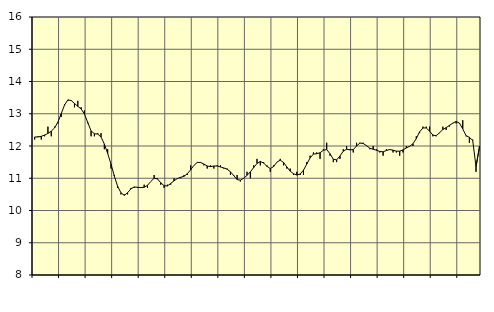
| Category | Piggar | Handel, SNI 45-47 |
|---|---|---|
| nan | 12.2 | 12.28 |
| 87.0 | 12.3 | 12.28 |
| 87.0 | 12.2 | 12.3 |
| 87.0 | 12.3 | 12.34 |
| nan | 12.6 | 12.39 |
| 88.0 | 12.3 | 12.46 |
| 88.0 | 12.6 | 12.56 |
| 88.0 | 12.7 | 12.74 |
| nan | 12.9 | 13 |
| 89.0 | 13.3 | 13.27 |
| 89.0 | 13.4 | 13.43 |
| 89.0 | 13.4 | 13.41 |
| nan | 13.2 | 13.32 |
| 90.0 | 13.4 | 13.23 |
| 90.0 | 13.2 | 13.15 |
| 90.0 | 13.1 | 12.99 |
| nan | 12.7 | 12.73 |
| 91.0 | 12.3 | 12.47 |
| 91.0 | 12.3 | 12.38 |
| 91.0 | 12.4 | 12.37 |
| nan | 12.4 | 12.28 |
| 92.0 | 11.9 | 12.06 |
| 92.0 | 11.9 | 11.77 |
| 92.0 | 11.3 | 11.44 |
| nan | 11.1 | 11.07 |
| 93.0 | 10.7 | 10.75 |
| 93.0 | 10.5 | 10.55 |
| 93.0 | 10.5 | 10.47 |
| nan | 10.5 | 10.55 |
| 94.0 | 10.7 | 10.67 |
| 94.0 | 10.7 | 10.73 |
| 94.0 | 10.7 | 10.72 |
| nan | 10.7 | 10.71 |
| 95.0 | 10.8 | 10.72 |
| 95.0 | 10.7 | 10.78 |
| 95.0 | 10.9 | 10.9 |
| nan | 11.1 | 11 |
| 96.0 | 11 | 10.98 |
| 96.0 | 10.8 | 10.86 |
| 96.0 | 10.7 | 10.77 |
| nan | 10.8 | 10.76 |
| 97.0 | 10.8 | 10.84 |
| 97.0 | 11 | 10.92 |
| 97.0 | 11 | 10.99 |
| nan | 11 | 11.03 |
| 98.0 | 11.1 | 11.06 |
| 98.0 | 11.1 | 11.14 |
| 98.0 | 11.4 | 11.26 |
| nan | 11.4 | 11.4 |
| 99.0 | 11.5 | 11.49 |
| 99.0 | 11.5 | 11.49 |
| 99.0 | 11.4 | 11.44 |
| nan | 11.3 | 11.38 |
| 0.0 | 11.4 | 11.36 |
| 0.0 | 11.3 | 11.38 |
| 0.0 | 11.4 | 11.38 |
| nan | 11.4 | 11.35 |
| 1.0 | 11.3 | 11.32 |
| 1.0 | 11.3 | 11.28 |
| 1.0 | 11.1 | 11.2 |
| nan | 11.1 | 11.08 |
| 2.0 | 11.1 | 10.96 |
| 2.0 | 10.9 | 10.94 |
| 2.0 | 11 | 11 |
| nan | 11.2 | 11.09 |
| 3.0 | 11 | 11.2 |
| 3.0 | 11.4 | 11.33 |
| 3.0 | 11.6 | 11.46 |
| nan | 11.4 | 11.52 |
| 4.0 | 11.5 | 11.47 |
| 4.0 | 11.4 | 11.37 |
| 4.0 | 11.2 | 11.3 |
| nan | 11.4 | 11.36 |
| 5.0 | 11.5 | 11.5 |
| 5.0 | 11.6 | 11.56 |
| 5.0 | 11.4 | 11.49 |
| nan | 11.3 | 11.35 |
| 6.0 | 11.3 | 11.22 |
| 6.0 | 11.1 | 11.14 |
| 6.0 | 11.2 | 11.1 |
| nan | 11.1 | 11.13 |
| 7.0 | 11.1 | 11.25 |
| 7.0 | 11.5 | 11.44 |
| 7.0 | 11.7 | 11.63 |
| nan | 11.8 | 11.75 |
| 8.0 | 11.8 | 11.76 |
| 8.0 | 11.6 | 11.79 |
| 8.0 | 11.9 | 11.87 |
| nan | 12.1 | 11.89 |
| 9.0 | 11.7 | 11.76 |
| 9.0 | 11.5 | 11.59 |
| 9.0 | 11.5 | 11.57 |
| nan | 11.6 | 11.69 |
| 10.0 | 11.9 | 11.84 |
| 10.0 | 12 | 11.9 |
| 10.0 | 11.9 | 11.88 |
| nan | 11.8 | 11.89 |
| 11.0 | 12.1 | 12 |
| 11.0 | 12.1 | 12.09 |
| 11.0 | 12.1 | 12.08 |
| nan | 12 | 12.01 |
| 12.0 | 11.9 | 11.93 |
| 12.0 | 12 | 11.9 |
| 12.0 | 11.9 | 11.87 |
| nan | 11.8 | 11.83 |
| 13.0 | 11.7 | 11.82 |
| 13.0 | 11.9 | 11.86 |
| 13.0 | 11.9 | 11.89 |
| nan | 11.8 | 11.87 |
| 14.0 | 11.8 | 11.84 |
| 14.0 | 11.7 | 11.84 |
| 14.0 | 11.8 | 11.88 |
| nan | 12 | 11.94 |
| 15.0 | 12 | 11.99 |
| 15.0 | 12 | 12.07 |
| 15.0 | 12.3 | 12.23 |
| nan | 12.4 | 12.44 |
| 16.0 | 12.6 | 12.56 |
| 16.0 | 12.6 | 12.56 |
| 16.0 | 12.6 | 12.46 |
| nan | 12.3 | 12.34 |
| 17.0 | 12.3 | 12.32 |
| 17.0 | 12.4 | 12.41 |
| 17.0 | 12.6 | 12.51 |
| nan | 12.5 | 12.57 |
| 18.0 | 12.6 | 12.64 |
| 18.0 | 12.7 | 12.71 |
| 18.0 | 12.7 | 12.76 |
| nan | 12.7 | 12.71 |
| 19.0 | 12.8 | 12.53 |
| 19.0 | 12.3 | 12.32 |
| 19.0 | 12.1 | 12.27 |
| nan | 12.2 | 12.17 |
| 20.0 | 11.2 | 11.36 |
| 20.0 | 12 | 11.95 |